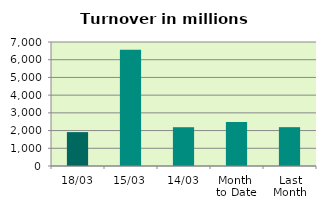
| Category | Series 0 |
|---|---|
| 18/03 | 1912.185 |
| 15/03 | 6563.08 |
| 14/03 | 2189.035 |
| Month 
to Date | 2477.118 |
| Last
Month | 2191.938 |